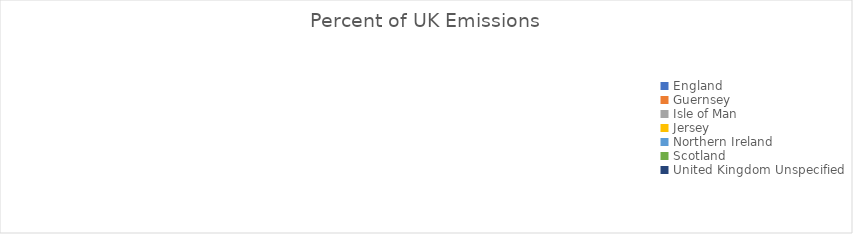
| Category | Percent of UK Emissions |
|---|---|
| England | 0 |
| Guernsey | 0 |
| Isle of Man | 0 |
| Jersey | 0 |
| Northern Ireland | 0 |
| Scotland | 0 |
| United Kingdom Unspecified | 0 |